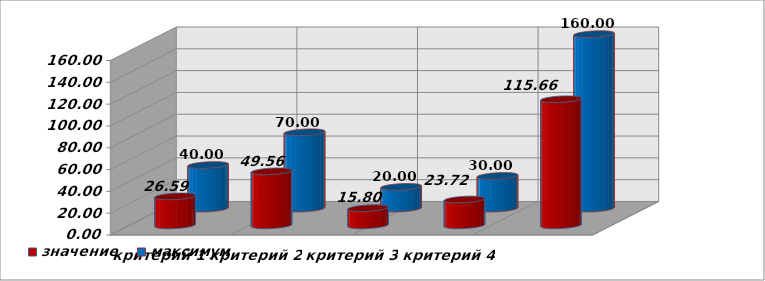
| Category | значение | максимум |
|---|---|---|
| критерий 1 | 26.587 | 40 |
| критерий 2 | 49.557 | 70 |
| критерий 3 | 15.799 | 20 |
| критерий 4 | 23.717 | 30 |